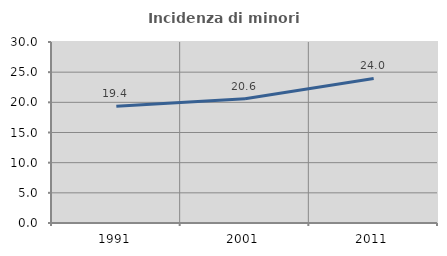
| Category | Incidenza di minori stranieri |
|---|---|
| 1991.0 | 19.355 |
| 2001.0 | 20.606 |
| 2011.0 | 23.952 |